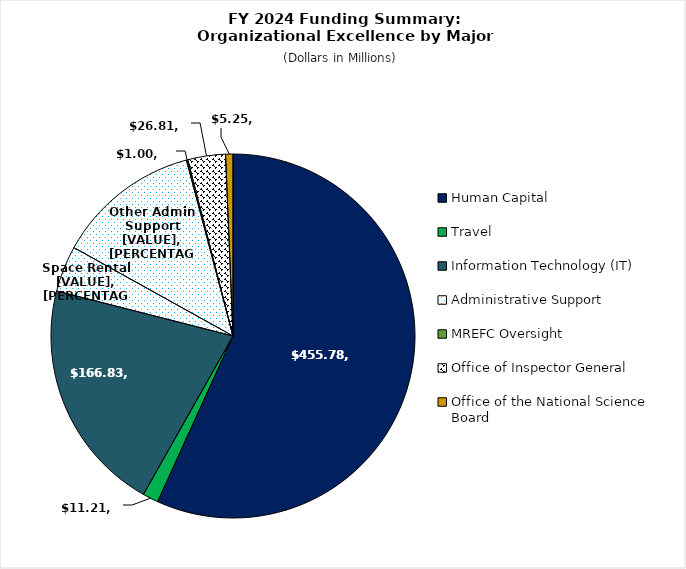
| Category | Organizational Excellence by Major Component |
|---|---|
| Human Capital | 455.783 |
| Travel | 11.21 |
| Information Technology (IT) | 166.83 |
| Administrative Support: Space Rental | 32.856 |
| Administrative Support | 102.791 |
| MREFC Oversight | 1 |
| Office of Inspector General | 26.81 |
| Office of the National Science Board | 5.25 |